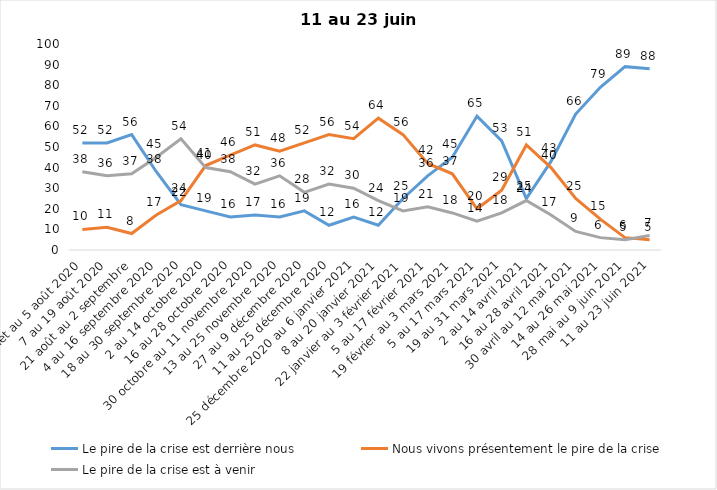
| Category | Le pire de la crise est derrière nous | Nous vivons présentement le pire de la crise | Le pire de la crise est à venir |
|---|---|---|---|
| 24 juillet au 5 août 2020 | 52 | 10 | 38 |
| 7 au 19 août 2020 | 52 | 11 | 36 |
| 21 août au 2 septembre | 56 | 8 | 37 |
| 4 au 16 septembre 2020 | 38 | 17 | 45 |
| 18 au 30 septembre 2020 | 22 | 24 | 54 |
| 2 au 14 octobre 2020 | 19 | 41 | 40 |
| 16 au 28 octobre 2020 | 16 | 46 | 38 |
| 30 octobre au 11 novembre 2020 | 17 | 51 | 32 |
| 13 au 25 novembre 2020 | 16 | 48 | 36 |
| 27 au 9 décembre 2020 | 19 | 52 | 28 |
| 11 au 25 décembre 2020 | 12 | 56 | 32 |
| 25 décembre 2020 au 6 janvier 2021 | 16 | 54 | 30 |
| 8 au 20 janvier 2021 | 12 | 64 | 24 |
| 22 janvier au 3 février 2021 | 25 | 56 | 19 |
| 5 au 17 février 2021 | 36 | 42 | 21 |
| 19 février au 3 mars 2021 | 45 | 37 | 18 |
| 5 au 17 mars 2021 | 65 | 20 | 14 |
| 19 au 31 mars 2021 | 53 | 29 | 18 |
| 2 au 14 avril 2021 | 25 | 51 | 24 |
| 16 au 28 avril 2021 | 43 | 40 | 17 |
| 30 avril au 12 mai 2021 | 66 | 25 | 9 |
| 14 au 26 mai 2021 | 79 | 15 | 6 |
| 28 mai au 9 juin 2021 | 89 | 6 | 5 |
| 11 au 23 juin 2021 | 88 | 5 | 7 |